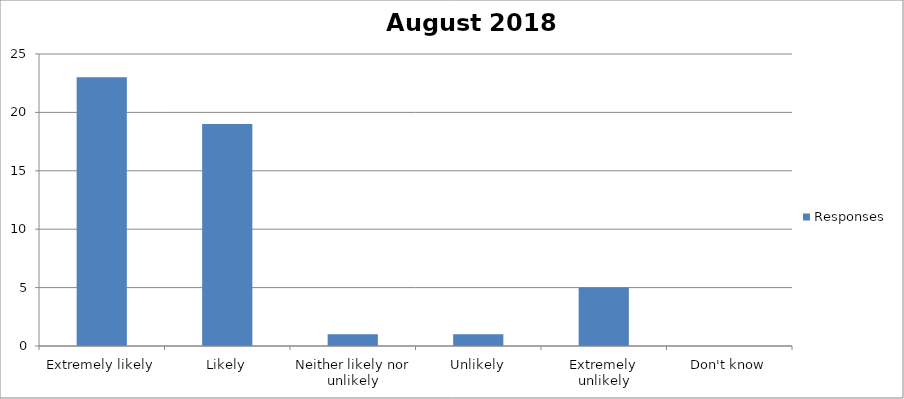
| Category | Responses |
|---|---|
| Extremely likely | 23 |
| Likely | 19 |
| Neither likely nor unlikely | 1 |
| Unlikely | 1 |
| Extremely unlikely | 5 |
| Don't know | 0 |